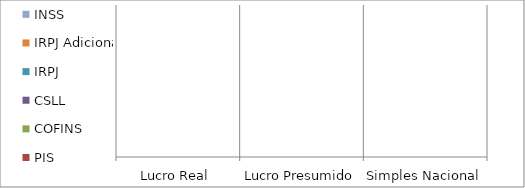
| Category | ISSQN | PIS | COFINS | CSLL | IRPJ | IRPJ Adicional | INSS |
|---|---|---|---|---|---|---|---|
| Lucro Real | 0 | 0 | 0 | 0 | 0 | 0 | 0 |
| Lucro Presumido | 0 | 0 | 0 | 0 | 0 | 0 | 0 |
| Simples Nacional | 0 | 0 | 0 | 0 | 0 | 0 | 0 |